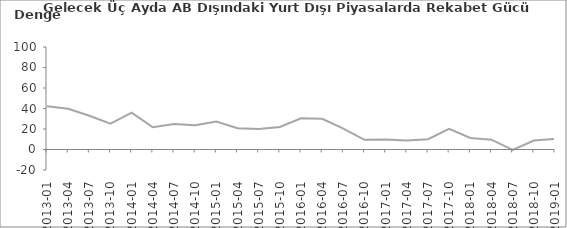
| Category | Gelecek Üç Aydaki AB Dışındaki Piyasalarda Rekabet Gücü Beklentisi |
|---|---|
| 2013-01 | 42.3 |
| 2013-04 | 39.7 |
| 2013-07 | 32.9 |
| 2013-10 | 25.2 |
| 2014-01 | 35.9 |
| 2014-04 | 21.7 |
| 2014-07 | 24.8 |
| 2014-10 | 23.7 |
| 2015-01 | 27.2 |
| 2015-04 | 20.8 |
| 2015-07 | 19.9 |
| 2015-10 | 22 |
| 2016-01 | 30.4 |
| 2016-04 | 29.9 |
| 2016-07 | 20.3 |
| 2016-10 | 9.4 |
| 2017-01 | 9.8 |
| 2017-04 | 8.9 |
| 2017-07 | 10.1 |
| 2017-10 | 20.2 |
| 2018-01 | 11.3 |
| 2018-04 | 9.6 |
| 2018-07 | -0.5 |
| 2018-10 | 8.7 |
| 2019-01 | 10.3 |